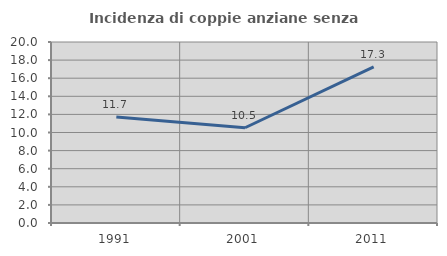
| Category | Incidenza di coppie anziane senza figli  |
|---|---|
| 1991.0 | 11.715 |
| 2001.0 | 10.526 |
| 2011.0 | 17.259 |